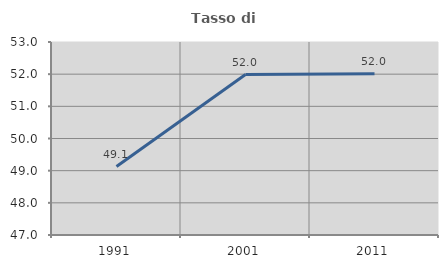
| Category | Tasso di occupazione   |
|---|---|
| 1991.0 | 49.127 |
| 2001.0 | 51.989 |
| 2011.0 | 52.009 |